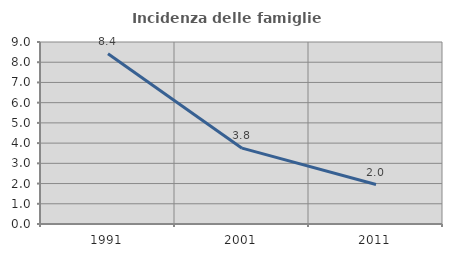
| Category | Incidenza delle famiglie numerose |
|---|---|
| 1991.0 | 8.416 |
| 2001.0 | 3.75 |
| 2011.0 | 1.952 |